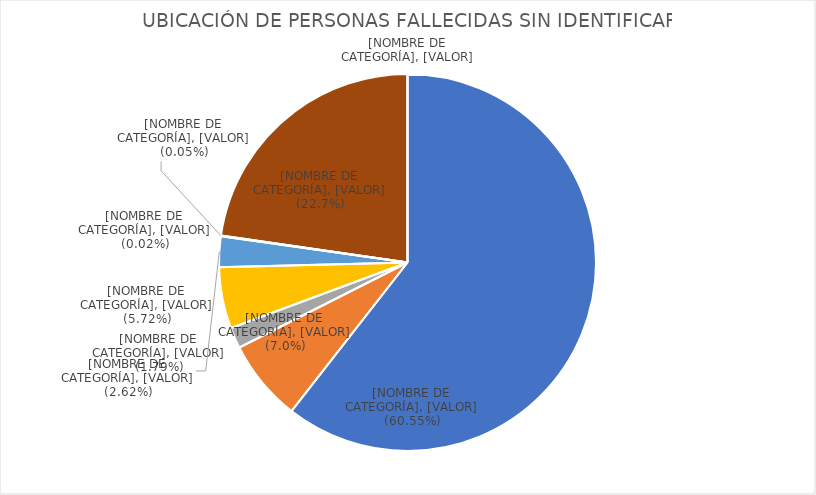
| Category | UBICACIÓN DE PERSONAS FALLECIDAS SIN IDENTIFICAR |
|---|---|
| FOSA COMÚN | 31488 |
| SEMEFO | 3641 |
| CENTROS DE RESGUARDO | 929 |
| UNIVERSIDADES | 2738 |
| CREMADOS | 1365 |
| SE DESCONOCE | 11 |
| TRANSFERIDOS | 26 |
| SIN ESPECIFICAR O NO RESPONDIÓ | 11806 |